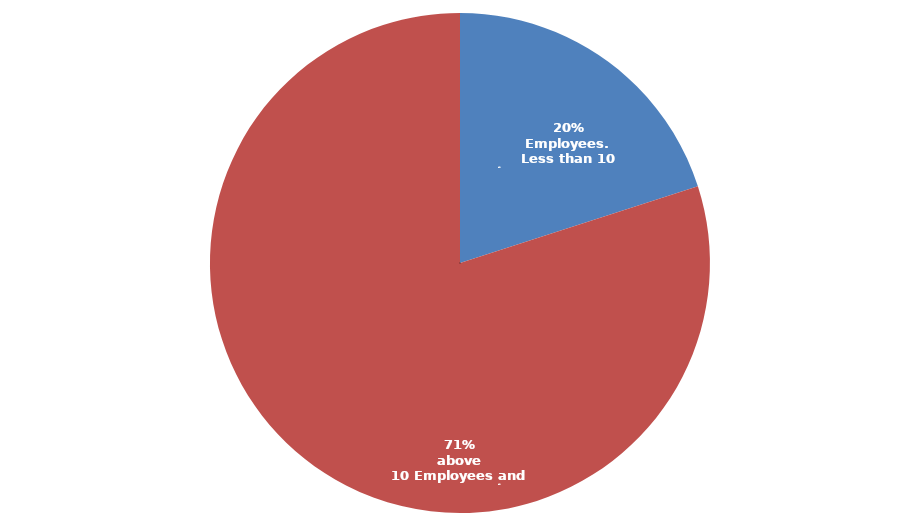
| Category | Series 0 |
|---|---|
| أقل من 10 مشتغل
Less than 10 Employees. | 150 |
|   10 مشتغل فأكثر
10 Employees and above | 599 |